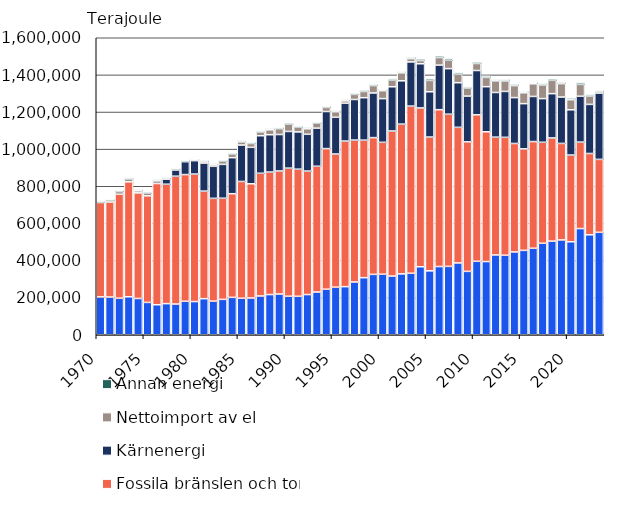
| Category | Förnybar energi | Fossila bränslen och torv | Kärnenergi | Nettoimport av el | Annan energi |
|---|---|---|---|---|---|
| 1970 | 204034 | 508504 | 0 | 1901 | 6019 |
| 1971 | 203391 | 511718 | 0 | 9324 | 5332 |
| 1972 | 196893 | 559888 | 0 | 15188 | 6235 |
| 1973 | 204727 | 619154 | 0 | 15548 | 6710 |
| 1974 | 195495 | 568746 | 0 | 11304 | 6376 |
| 1975 | 174262 | 574160 | 0 | 14353 | 7009 |
| 1976 | 161759 | 652963 | 0 | 14454 | 6905 |
| 1977 | 167731 | 643076 | 27382 | 3208 | 5018 |
| 1978 | 165642 | 688482 | 33589 | 4597 | 3762 |
| 1979 | 180305 | 682582 | 69382 | 2336 | 4806 |
| 1980 | 178903 | 686739 | 72273 | 4360 | 4590 |
| 1981 | 194307 | 579548 | 150927 | 8078 | 5724 |
| 1982 | 181119 | 553807 | 172647 | 8330 | 6156 |
| 1983 | 190664 | 544813 | 182367 | 17201 | 6354 |
| 1984 | 201454 | 558455 | 194171 | 18774 | 6646 |
| 1985 | 196619 | 629150 | 196145 | 17017 | 6908 |
| 1986 | 197924 | 615426 | 196342 | 20905 | 6811 |
| 1987 | 208971 | 661019 | 202189 | 20142 | 6779 |
| 1988 | 216562 | 659887 | 201240 | 26586 | 7196 |
| 1989 | 219571 | 662704 | 196473 | 31925 | 7398 |
| 1990 | 207422 | 690098 | 197760 | 38671 | 7405 |
| 1991 | 207239 | 684720 | 200804 | 25862 | 6091 |
| 1992 | 216629 | 665041 | 198218 | 29632 | 6872 |
| 1993 | 230190 | 677551 | 205091 | 27133 | 6159 |
| 1994 | 245453 | 757326 | 199942 | 21881 | 6551 |
| 1995 | 256458 | 717360 | 197760 | 30258 | 6784 |
| 1996 | 259208 | 784276 | 203771 | 13180 | 6194 |
| 1997 | 284274 | 764448 | 218738 | 27551 | 7069 |
| 1998 | 307479 | 740875 | 228829 | 33502 | 7822 |
| 1999 | 325310 | 736677 | 240655 | 40046 | 7520 |
| 2000 | 326231 | 710532 | 235364 | 42768 | 7678 |
| 2001 | 316275 | 781430 | 238406 | 35852 | 7762 |
| 2002 | 328174 | 806541 | 233398 | 42930 | 7996 |
| 2003 | 331314 | 900452 | 238145 | 17467 | 8328 |
| 2004 | 366403 | 855530 | 237970 | 17532 | 8783 |
| 2005 | 344430 | 720697 | 243887 | 61250 | 9285 |
| 2006 | 367566 | 844939 | 240040 | 41044 | 9203 |
| 2007 | 368289 | 819840 | 245468 | 45205 | 9404 |
| 2008 | 386825 | 730554 | 240542 | 45980 | 9273 |
| 2009 | 341532 | 697567 | 246555 | 43504 | 7137 |
| 2010 | 395818 | 788983 | 238789 | 37802 | 8506 |
| 2011 | 394362 | 699146 | 242897 | 49863 | 7837 |
| 2012 | 429960 | 634540 | 240685 | 62796 | 7614 |
| 2013 | 428416 | 635098 | 247347 | 56574 | 8308 |
| 2014 | 446145 | 584371 | 247047 | 64678 | 8372 |
| 2015 | 454640 | 546856 | 243556 | 58813 | 8264 |
| 2016 | 465983 | 574833 | 243056 | 68222 | 8246 |
| 2017 | 492970 | 543915 | 235352 | 73532 | 8287 |
| 2018 | 504503 | 555693 | 238700 | 71769 | 8512 |
| 2019 | 511004 | 519670 | 249981 | 72151 | 8227 |
| 2020 | 501069 | 467029 | 243864 | 54377 | 9391 |
| 2021 | 572222 | 465643 | 247047 | 63965 | 9295 |
| 2022 | 538598 | 437906 | 264458 | 45063 | 8212 |
| 2023* | 552000 | 392850 | 357129 | 6207 | 8192 |